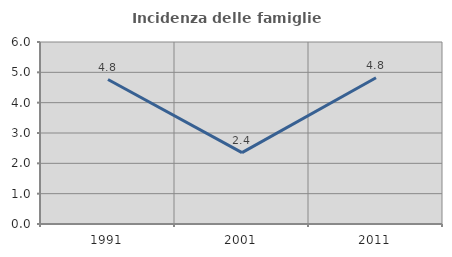
| Category | Incidenza delle famiglie numerose |
|---|---|
| 1991.0 | 4.762 |
| 2001.0 | 2.353 |
| 2011.0 | 4.819 |